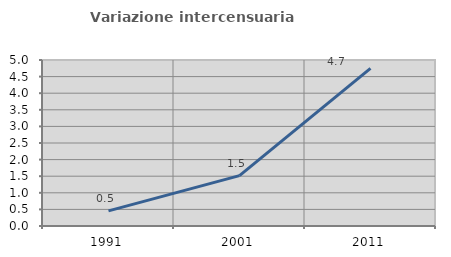
| Category | Variazione intercensuaria annua |
|---|---|
| 1991.0 | 0.457 |
| 2001.0 | 1.518 |
| 2011.0 | 4.747 |